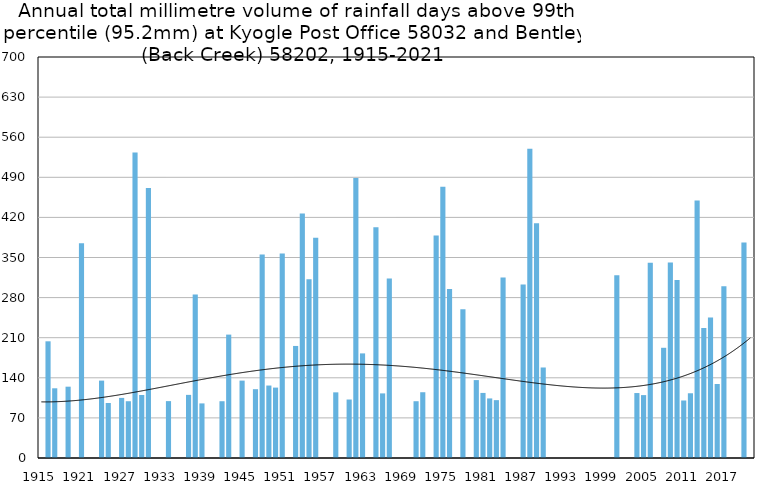
| Category | Annual total mm in days above 99th percentile |
|---|---|
| 1915 | 0 |
| 1916 | 203.7 |
| 1917 | 121.7 |
| 1918 | 0 |
| 1919 | 124.5 |
| 1920 | 0 |
| 1921 | 374.9 |
| 1922 | 0 |
| 1923 | 0 |
| 1924 | 135.1 |
| 1925 | 96 |
| 1926 | 0 |
| 1927 | 104.9 |
| 1928 | 99.1 |
| 1929 | 533.2 |
| 1930 | 110 |
| 1931 | 471.5 |
| 1932 | 0 |
| 1933 | 0 |
| 1934 | 99.3 |
| 1935 | 0 |
| 1936 | 0 |
| 1937 | 110.2 |
| 1938 | 285.2 |
| 1939 | 95.3 |
| 1940 | 0 |
| 1941 | 0 |
| 1942 | 99.1 |
| 1943 | 215.4 |
| 1944 | 0 |
| 1945 | 135.1 |
| 1946 | 0 |
| 1947 | 120.1 |
| 1948 | 355.3 |
| 1949 | 126.5 |
| 1950 | 122.9 |
| 1951 | 356.9 |
| 1952 | 0 |
| 1953 | 195.6 |
| 1954 | 427 |
| 1955 | 312.1 |
| 1956 | 384.3 |
| 1957 | 0 |
| 1958 | 0 |
| 1959 | 114.6 |
| 1960 | 0 |
| 1961 | 102.1 |
| 1962 | 488.8 |
| 1963 | 182.6 |
| 1964 | 0 |
| 1965 | 402.8 |
| 1966 | 112.8 |
| 1967 | 313.2 |
| 1968 | 0 |
| 1969 | 0 |
| 1970 | 0 |
| 1971 | 99.1 |
| 1972 | 114.8 |
| 1973 | 0 |
| 1974 | 388.6 |
| 1975 | 473.6 |
| 1976 | 294.9 |
| 1977 | 0 |
| 1978 | 259.8 |
| 1979 | 0 |
| 1980 | 136 |
| 1981 | 113.6 |
| 1982 | 104 |
| 1983 | 101 |
| 1984 | 315 |
| 1985 | 0 |
| 1986 | 0 |
| 1987 | 303 |
| 1988 | 540 |
| 1989 | 410 |
| 1990 | 158 |
| 1991 | 0 |
| 1992 | 0 |
| 1993 | 0 |
| 1994 | 0 |
| 1995 | 0 |
| 1996 | 0 |
| 1997 | 0 |
| 1998 | 0 |
| 1999 | 0 |
| 2000 | 0 |
| 2001 | 319.2 |
| 2002 | 0 |
| 2003 | 0 |
| 2004 | 113.4 |
| 2005 | 109.8 |
| 2006 | 341 |
| 2007 | 0 |
| 2008 | 192.4 |
| 2009 | 341.4 |
| 2010 | 310.6 |
| 2011 | 100.4 |
| 2012 | 113 |
| 2013 | 449.4 |
| 2014 | 227 |
| 2015 | 245.4 |
| 2016 | 129.2 |
| 2017 | 300 |
| 2018 | 0 |
| 2019 | 0 |
| 2020 | 376 |
| 2021 | 0 |